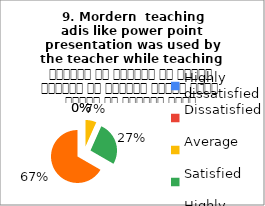
| Category |  9. Mordern  teaching 
adis like power point presentation was used by the teacher while teaching  शिक्षक ने शिक्षण के दौरान शिक्षण की आधुनिक तकनीक पावर पॉइंट का प्रयोग किया |
|---|---|
| Highly dissatisfied | 0 |
| Dissatisfied | 0 |
| Average | 1 |
| Satisfied | 4 |
| Highly satisfied | 10 |